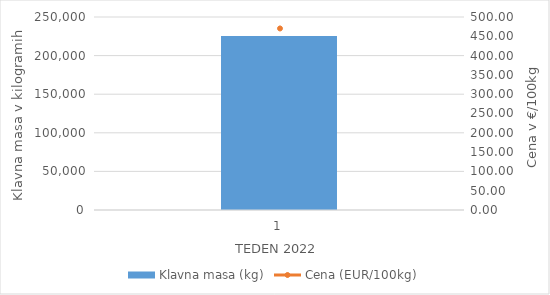
| Category | Klavna masa (kg) |
|---|---|
| 1.0 | 225300 |